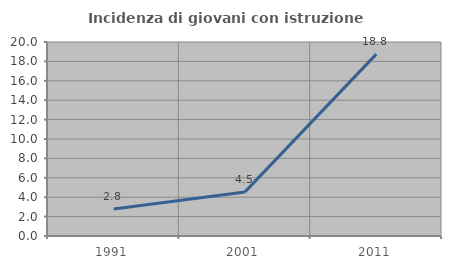
| Category | Incidenza di giovani con istruzione universitaria |
|---|---|
| 1991.0 | 2.778 |
| 2001.0 | 4.545 |
| 2011.0 | 18.75 |